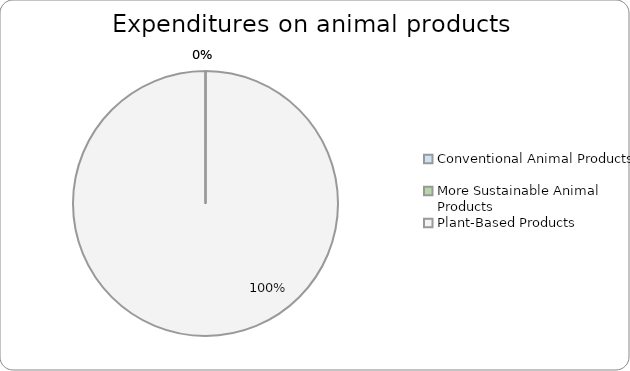
| Category | Series 0 |
|---|---|
| Conventional Animal Products | 0 |
| More Sustainable Animal Products | 0 |
| Plant-Based Products | 1 |